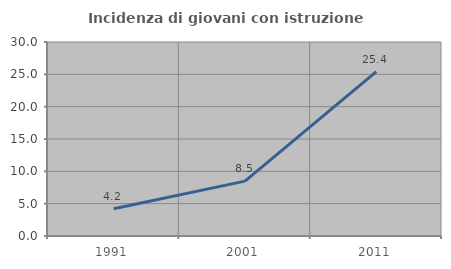
| Category | Incidenza di giovani con istruzione universitaria |
|---|---|
| 1991.0 | 4.225 |
| 2001.0 | 8.491 |
| 2011.0 | 25.424 |